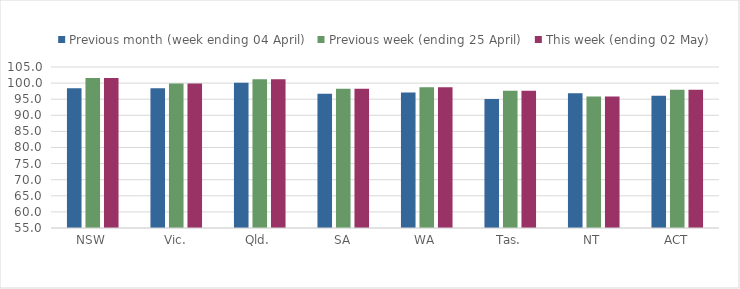
| Category | Previous month (week ending 04 April) | Previous week (ending 25 April) | This week (ending 02 May) |
|---|---|---|---|
| NSW | 98.388 | 101.615 | 101.615 |
| Vic. | 98.411 | 99.855 | 99.855 |
| Qld. | 100.129 | 101.21 | 101.21 |
| SA | 96.712 | 98.254 | 98.254 |
| WA | 97.055 | 98.738 | 98.738 |
| Tas. | 95.049 | 97.591 | 97.591 |
| NT | 96.831 | 95.869 | 95.869 |
| ACT | 96.093 | 97.92 | 97.92 |